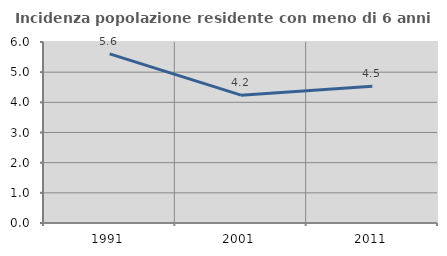
| Category | Incidenza popolazione residente con meno di 6 anni |
|---|---|
| 1991.0 | 5.606 |
| 2001.0 | 4.238 |
| 2011.0 | 4.537 |